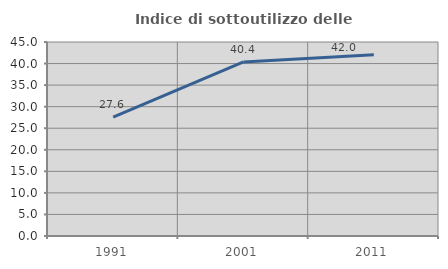
| Category | Indice di sottoutilizzo delle abitazioni  |
|---|---|
| 1991.0 | 27.586 |
| 2001.0 | 40.37 |
| 2011.0 | 42.024 |